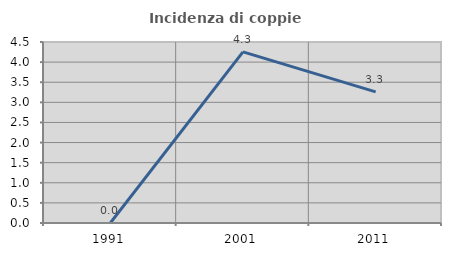
| Category | Incidenza di coppie miste |
|---|---|
| 1991.0 | 0 |
| 2001.0 | 4.255 |
| 2011.0 | 3.261 |